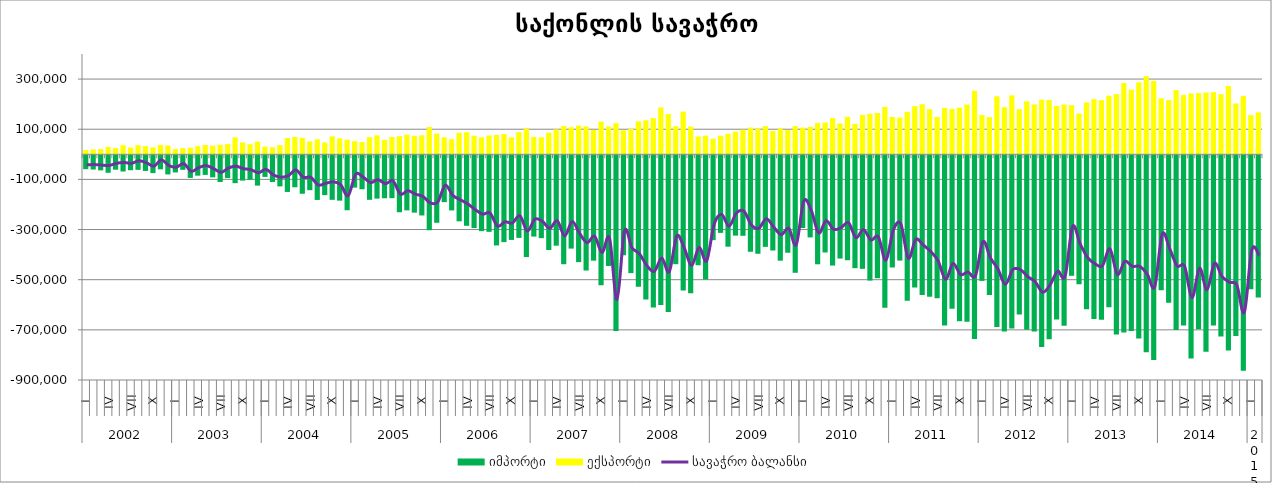
| Category | იმპორტი | ექსპორტი |
|---|---|---|
| 0 | -59263.521 | 17046.178 |
| 1 | -60769.649 | 19840.353 |
| 2 | -64014.557 | 20979.385 |
| 3 | -73666.921 | 29167.512 |
| 4 | -61445.084 | 25582.516 |
| 5 | -68542.72 | 36002.6 |
| 6 | -63507.762 | 27395.452 |
| 7 | -62037.985 | 36347.22 |
| 8 | -66401.266 | 32730.72 |
| 9 | -74912.566 | 27655.771 |
| 10 | -59940.895 | 37584.417 |
| 11 | -80188.676 | 35403.943 |
| 12 | -72401.098 | 21158.023 |
| 13 | -61987.089 | 24694.457 |
| 14 | -94186.754 | 26281.929 |
| 15 | -85232.62 | 32321.355 |
| 16 | -82128.241 | 37141.475 |
| 17 | -91867.872 | 34538.61 |
| 18 | -110297.773 | 38363.383 |
| 19 | -94827.556 | 40571.436 |
| 20 | -115071.822 | 67521.508 |
| 21 | -104834.683 | 47512.168 |
| 22 | -101426.402 | 40266.671 |
| 23 | -124777.249 | 50939.023 |
| 24 | -90172.301 | 30639.628 |
| 25 | -110292.93 | 28110.903 |
| 26 | -127920.664 | 36748.014 |
| 27 | -150078.12 | 64934.645 |
| 28 | -131396.414 | 69193.841 |
| 29 | -157306.131 | 65653.407 |
| 30 | -143108.477 | 51351.514 |
| 31 | -181979.322 | 59598.997 |
| 32 | -162696.006 | 46923.79 |
| 33 | -181546.328 | 71829.719 |
| 34 | -184764.226 | 63670.019 |
| 35 | -223082.011 | 58248.485 |
| 36 | -132828.78 | 52696.108 |
| 37 | -139370.599 | 48765.565 |
| 38 | -181483.411 | 68501.057 |
| 39 | -176781.585 | 75741.302 |
| 40 | -175254.128 | 57851.798 |
| 41 | -174885.69 | 69134.151 |
| 42 | -231116.326 | 72308.066 |
| 43 | -223586.064 | 78463.868 |
| 44 | -232598.062 | 73906.345 |
| 45 | -243875.6 | 76088.518 |
| 46 | -302744.711 | 108971.508 |
| 47 | -273023.39 | 83027.349 |
| 48 | -190830.766 | 67664.824 |
| 49 | -223705.954 | 60390.422 |
| 50 | -267199.678 | 86057.909 |
| 51 | -285173.636 | 87853.108 |
| 52 | -294324.498 | 74352.192 |
| 53 | -306342.435 | 67722.574 |
| 54 | -309216.396 | 75033.143 |
| 55 | -363444.69 | 76934.413 |
| 56 | -350176.667 | 80899.441 |
| 57 | -341398.1 | 67518.88 |
| 58 | -333288.931 | 88450.445 |
| 59 | -409730.694 | 103497.275 |
| 60 | -328137.428 | 69473.835 |
| 61 | -334459.902 | 67469.561 |
| 62 | -381545.727 | 86485.258 |
| 63 | -364407.83 | 99579.043 |
| 64 | -438345.425 | 112612.284 |
| 65 | -375919.942 | 107918.489 |
| 66 | -429942.484 | 114501.191 |
| 67 | -463469.136 | 111126.511 |
| 68 | -424050.769 | 97183.969 |
| 69 | -522267.672 | 130413.835 |
| 70 | -445390.926 | 110997.546 |
| 71 | -704213.005 | 124348.947 |
| 72 | -402575.025 | 96157.037 |
| 73 | -473805.365 | 101214.427 |
| 74 | -527726.957 | 131397.232 |
| 75 | -579390.37 | 135532.592 |
| 76 | -610953.408 | 144223.295 |
| 77 | -600700.531 | 187019.429 |
| 78 | -629238.431 | 160784.767 |
| 79 | -438214.751 | 112046.47 |
| 80 | -543482.238 | 170475.427 |
| 81 | -553710.327 | 110823.513 |
| 82 | -442400.172 | 71226.822 |
| 83 | -499342.768 | 74444.228 |
| 84 | -342172.891 | 61992.595 |
| 85 | -313305.2 | 73882.564 |
| 86 | -368421.542 | 81964.131 |
| 87 | -324331.62 | 90575.384 |
| 88 | -325013.796 | 98333.759 |
| 89 | -388587.943 | 106636.938 |
| 90 | -396599.106 | 102008.498 |
| 91 | -369105.39 | 112226.511 |
| 92 | -383616.972 | 92627.175 |
| 93 | -424156.143 | 103821.906 |
| 94 | -392445.75 | 97243.451 |
| 95 | -472487.714 | 112309.489 |
| 96 | -293895.433 | 106064.492 |
| 97 | -331405.786 | 109307.304 |
| 98 | -438593.88 | 125094.217 |
| 99 | -391466.377 | 126732.826 |
| 100 | -443586.207 | 144566.325 |
| 101 | -415754.856 | 123019.4 |
| 102 | -422418.39 | 149517.049 |
| 103 | -454069.86 | 121491.454 |
| 104 | -456766.108 | 156666.699 |
| 105 | -503426.607 | 161726.515 |
| 106 | -494134.733 | 164687.607 |
| 107 | -611604.197 | 188598.168 |
| 108 | -451309.458 | 149010.644 |
| 109 | -423793.525 | 146578.748 |
| 110 | -583825.022 | 169493.189 |
| 111 | -531280.086 | 191970.173 |
| 112 | -561216.825 | 199783.493 |
| 113 | -567722.238 | 180198.594 |
| 114 | -573950.28 | 149150.663 |
| 115 | -682821.526 | 184407.918 |
| 116 | -616128.006 | 180852.789 |
| 117 | -666126.682 | 186641.23 |
| 118 | -667818.752 | 198251.768 |
| 119 | -736741.388 | 252796.62 |
| 120 | -504795.744 | 156548.304 |
| 121 | -561245.241 | 148452.793 |
| 122 | -688545.632 | 231354.031 |
| 123 | -706187.659 | 187713.44 |
| 124 | -694827.44 | 235062.822 |
| 125 | -639198.689 | 179645.423 |
| 126 | -699314.296 | 211478.747 |
| 127 | -707051.188 | 198935.781 |
| 128 | -768121.772 | 218103.736 |
| 129 | -737103.652 | 216869.809 |
| 130 | -658928.109 | 192707.068 |
| 131 | -684156.84 | 198511.792 |
| 132 | -484510.166 | 196270.253 |
| 133 | -517895.062 | 162100.421 |
| 134 | -618028.057 | 207058.123 |
| 135 | -656766.022 | 220319.968 |
| 136 | -660133.83 | 216011.247 |
| 137 | -610381.872 | 233583.127 |
| 138 | -718870.489 | 240016.286 |
| 139 | -710962.361 | 284268.477 |
| 140 | -704339.98 | 257853.114 |
| 141 | -734189.374 | 287023.64 |
| 142 | -789551.275 | 311739.566 |
| 143 | -820086.931 | 292254.741 |
| 144 | -542427.286 | 223612.854 |
| 145 | -591950.372 | 216056.361 |
| 146 | -701034.248 | 256202.016 |
| 147 | -682942.999 | 236606.206 |
| 148 | -814368.234 | 242506.121 |
| 149 | -697796.037 | 244083.524 |
| 150 | -787009.075 | 246465.522 |
| 151 | -682549.858 | 247769.838 |
| 152 | -726340.963 | 239731.245 |
| 153 | -782290.909 | 272322.182 |
| 154 | -724680.114 | 202926.728 |
| 155 | -862879.859 | 233012.969 |
| 156 | -538050.722 | 156419.793 |
| 157 | -571187.878 | 167210.896 |